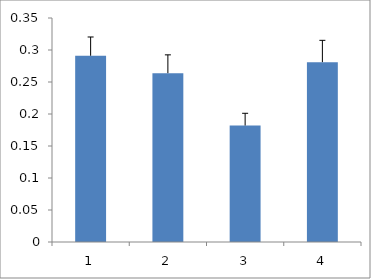
| Category | Series 0 |
|---|---|
| 0 | 0.291 |
| 1 | 0.264 |
| 2 | 0.182 |
| 3 | 0.281 |